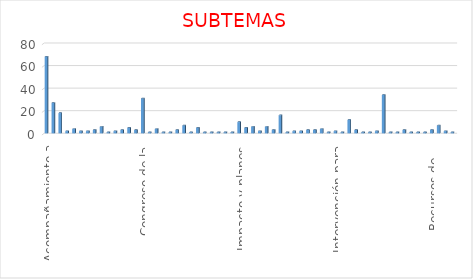
| Category | CANT |
|---|---|
| Acompañamiento a comunidad en desarrollo de proyecto (ambiental, social) | 68 |
| Actividad Hidrocarburífera en regiones del país | 27 |
| Áreas Asignadas, Áreas libres, reglamentación especial, requisitos y criterios para su asignación | 18 |
| Asesoría para negociar predio con evidencia de existencia de petróleo | 2 |
| Cartografía zonas Petrolera | 4 |
| Certificación de ejecución presupuestal | 2 |
| Certificacion Laboral Colaborador | 2 |
| Certificación laboral Colaborador (funcionario o contratista) | 3 |
| Cifras oficiales de producción en el país (producción, precio, demanda, Columnas Estratigráficas | 6 |
| Competencia Agencia Nacional de Minería  | 1 |
| Competencia Autoridad Nacional de Licencias Ambientales  | 2 |
| Competencia del Ministerio de Minas y Energía  | 3 |
| Competencia Ecopetrol  | 5 |
| Comportamiento del mercado de hidrocarburos en Colombia (producción y consumo interno petróleo y gas) | 3 |
| Congreso de la República y Senado  | 31 |
| Coordenadas de los vértices que limitan bloques | 1 |
| Copias de contratos (E&P, TEAS y Administrativos) | 4 |
| Derechos e Impuestos de Hidrocarburos | 1 |
| Documentos de las historias laborales | 1 |
| Empresas con pozos en producción o exploración | 3 |
| Estado actual de Pozos | 7 |
| Estado de contrato de asociación | 1 |
| Estudios geofísicos y de sísmica | 5 |
| Existencia yacimiento de Petróleo | 1 |
| Exploración yacimientos y títulos míneros | 1 |
| Forma de pago a los operadores de los bloques | 1 |
| Fracking  | 1 |
| Geología de Cuencas | 1 |
| Impacto y planes de manejo ambiental: Licencias, compromisos E&P normatividad, contaminación | 10 |
| Incoder Titulación de Baldíos  | 5 |
| Inconformidad por desarrollo irregular de proyecto | 6 |
| informacion con fines academicos | 2 |
| Información con fines Académicos (tesis de pregrado y postgrado) | 6 |
| Información de Operadores en Colombia | 3 |
| Información del trámite o proceso para pago de regalías | 16 |
| Información en formato shapefile acerca de las reservas naturales, humedales y comunidades | 1 |
| Información Geológica de perforaciones | 2 |
| Información Institucional: Transformación de Ecopetrol en ANH, misión, visión, funciones y objetivos | 2 |
| Información proyectos de perforación y profundidad | 3 |
| Información y aclaración procesos contractuales, términos de referencia, plazos, pólizas | 3 |
| Información y aclaración sobre los TEAs, E&P, Bloques | 4 |
| Informes sobres Consultas previas | 1 |
| Intervención para que compañía pague daños causados o tomar correctivos | 2 |
| Intervención para que operador vincule personal | 1 |
| Intervención por no pago a subcontratistas por parte de Operadoras  | 12 |
| Líneas sísmicas por cuenca | 3 |
| Mapa de Geoquímica | 1 |
| Muestras de Pozos | 1 |
| No aplica | 2 |
| Otros | 34 |
| Planes de manejo ambiental: Licencias, compromisos E&P, normatividad contaminación | 1 |
| Planes y proyectos de exploración y expansión de hidrocarburos | 1 |
| Probable existencia de yacimiento Petrolero | 3 |
| Promoción y Mercadeo Eventos por realizar organizados ANH | 1 |
| Proyecciones del país en pozos y sísmica | 1 |
| Publicaciones e Informes, Estudios: geofísicos, sísmica y estratigrafía | 1 |
| Recursos de regalías girados por municipio y departamentos | 3 |
| Reliquidación de regalías | 7 |
| Reservas probadas ó estimadas de Hidrocarburos en Colombia | 2 |
| Seguros de bienes y muebles de la ANH | 1 |